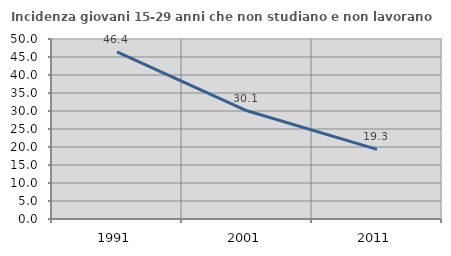
| Category | Incidenza giovani 15-29 anni che non studiano e non lavorano  |
|---|---|
| 1991.0 | 46.429 |
| 2001.0 | 30.055 |
| 2011.0 | 19.324 |